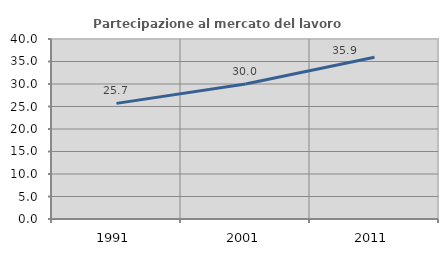
| Category | Partecipazione al mercato del lavoro  femminile |
|---|---|
| 1991.0 | 25.695 |
| 2001.0 | 30.004 |
| 2011.0 | 35.934 |